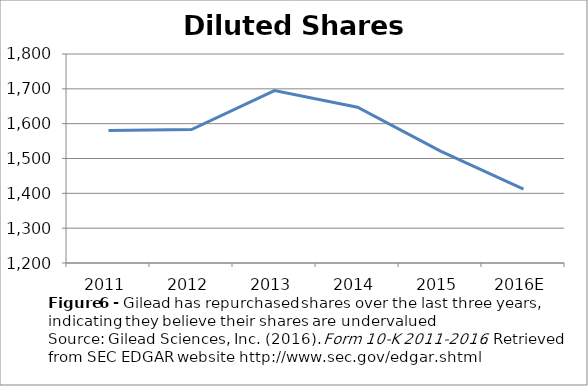
| Category | Diluted Shares Outstanding |
|---|---|
| 2011 | 1580.236 |
| 2012 | 1583 |
| 2013 | 1695 |
| 2014 | 1647 |
| 2015 | 1521 |
| 2016E | 1412 |